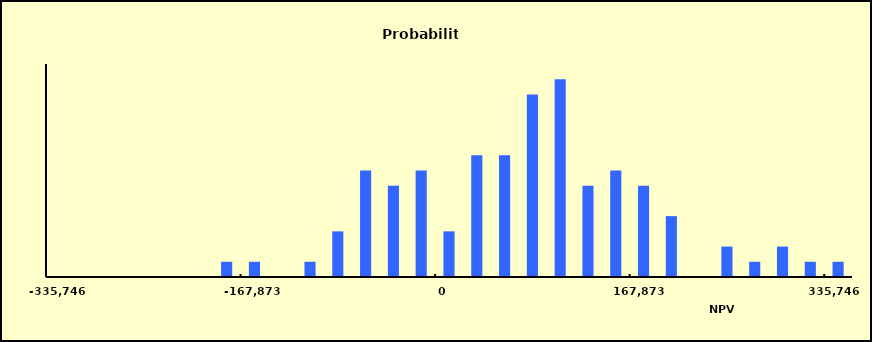
| Category | Series 2 |
|---|---|
| -335746.08618091774 | 0 |
| -311764.22288228077 | 0 |
| -287782.3595836438 | 0 |
| -263800.4962850068 | 0 |
| -239818.6329863698 | 0 |
| -215836.76968773283 | 0 |
| -191854.90638909585 | 0.01 |
| -167873.04309045887 | 0.01 |
| -143891.1797918219 | 0 |
| -119909.31649318492 | 0.01 |
| -95927.45319454794 | 0.03 |
| -71945.58989591096 | 0.07 |
| -47963.72659727397 | 0.06 |
| -23981.863298636985 | 0.07 |
| 0.0 | 0.03 |
| 23981.863298636985 | 0.08 |
| 47963.72659727397 | 0.08 |
| 71945.58989591096 | 0.12 |
| 95927.45319454794 | 0.13 |
| 119909.31649318492 | 0.06 |
| 143891.1797918219 | 0.07 |
| 167873.04309045887 | 0.06 |
| 191854.90638909585 | 0.04 |
| 215836.76968773283 | 0 |
| 239818.6329863698 | 0.02 |
| 263800.4962850068 | 0.01 |
| 287782.3595836438 | 0.02 |
| 311764.22288228077 | 0.01 |
| 335746.08618091774 | 0.01 |